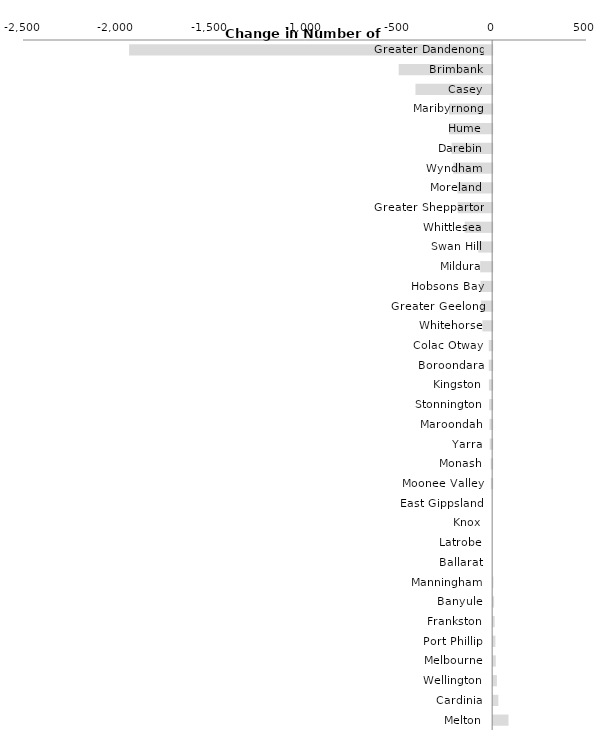
| Category | Series 0 |
|---|---|
| Greater Dandenong | -1934.706 |
| Brimbank | -498.196 |
| Casey | -408.73 |
| Maribyrnong | -229.777 |
| Hume | -229.685 |
| Darebin | -216 |
| Wyndham | -206.36 |
| Moreland | -184.377 |
| Greater Shepparton | -184 |
| Whittlesea | -146.156 |
| Swan Hill | -74 |
| Mildura | -64 |
| Hobsons Bay | -62.279 |
| Greater Geelong | -60 |
| Whitehorse | -52.17 |
| Colac Otway | -18 |
| Boroondara | -18 |
| Kingston | -17.294 |
| Stonnington | -16 |
| Maroondah | -14 |
| Yarra | -13 |
| Monash | -8 |
| Moonee Valley | -7.054 |
| East Gippsland | 0 |
| Knox | 0 |
| Latrobe | 0 |
| Ballarat | 0 |
| Manningham | 1.17 |
| Banyule | 5 |
| Frankston | 8.128 |
| Port Phillip | 12 |
| Melbourne | 14 |
| Wellington | 20 |
| Cardinia | 27.602 |
| Melton | 81.665 |